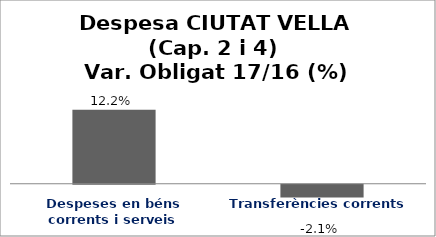
| Category | Series 0 |
|---|---|
| Despeses en béns corrents i serveis | 0.122 |
| Transferències corrents | -0.021 |